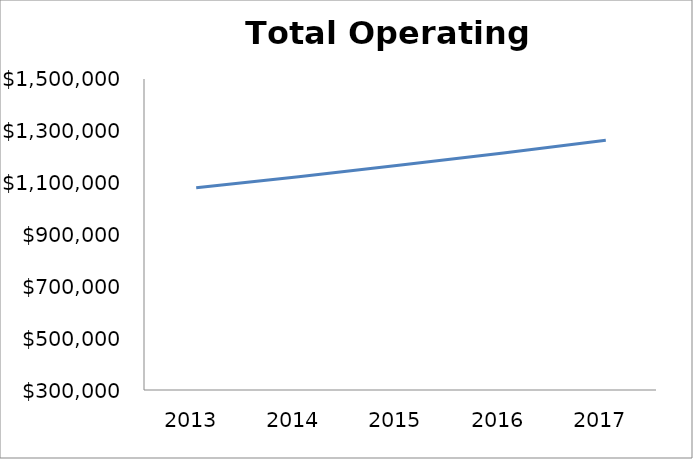
| Category | Operating Expenses |
|---|---|
| 2013.0 | 1080038 |
| 2014.0 | 1123239.52 |
| 2015.0 | 1168169.101 |
| 2016.0 | 1214895.865 |
| 2017.0 | 1263491.699 |